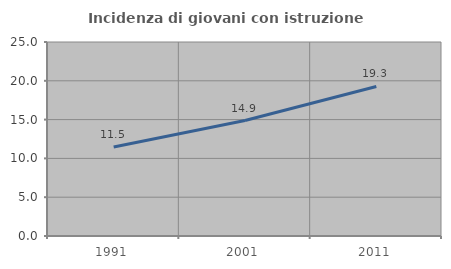
| Category | Incidenza di giovani con istruzione universitaria |
|---|---|
| 1991.0 | 11.475 |
| 2001.0 | 14.876 |
| 2011.0 | 19.271 |